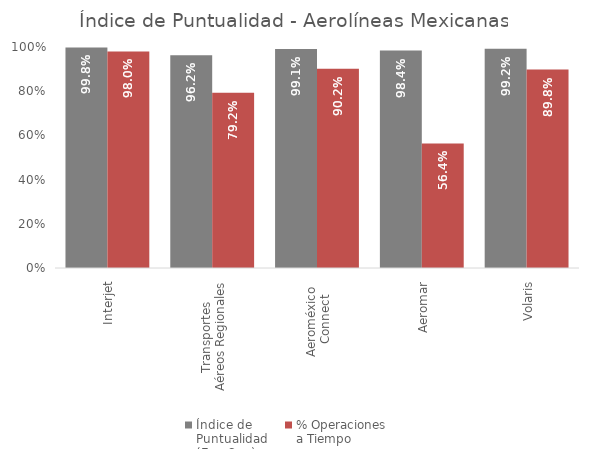
| Category | Índice de 
Puntualidad
(Ene-Sep) | % Operaciones 
a Tiempo |
|---|---|---|
| Interjet | 0.998 | 0.98 |
| Transportes 
Aéreos Regionales | 0.962 | 0.792 |
| Aeroméxico 
Connect | 0.991 | 0.902 |
| Aeromar | 0.984 | 0.564 |
| Volaris | 0.992 | 0.898 |